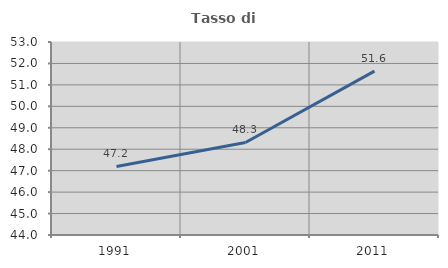
| Category | Tasso di occupazione   |
|---|---|
| 1991.0 | 47.198 |
| 2001.0 | 48.315 |
| 2011.0 | 51.64 |